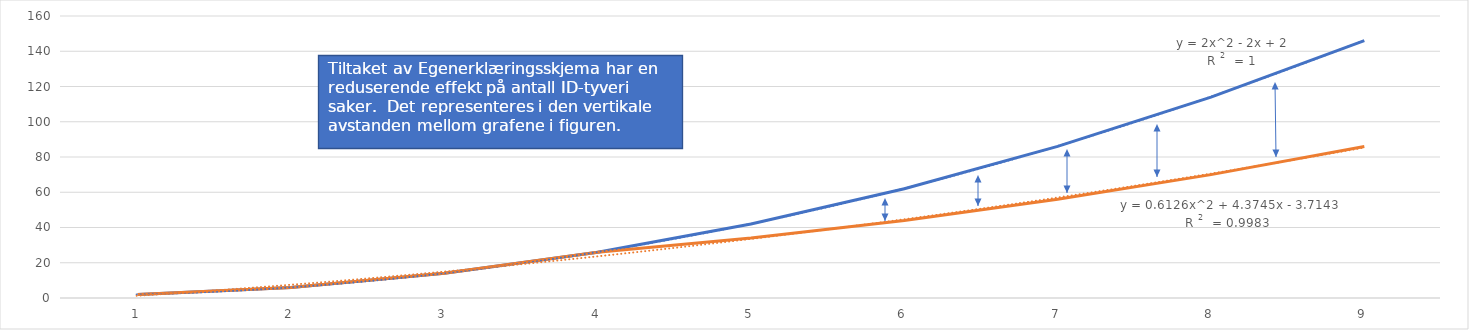
| Category | Antall saker uten tiltak: | Antall saker med tiltak: |
|---|---|---|
| 0 | 2 | 2 |
| 1 | 6 | 6 |
| 2 | 14 | 14 |
| 3 | 26 | 26 |
| 4 | 42 | 34 |
| 5 | 62 | 44 |
| 6 | 86 | 56 |
| 7 | 114 | 70 |
| 8 | 146 | 86 |